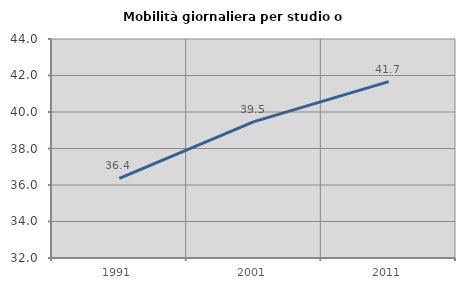
| Category | Mobilità giornaliera per studio o lavoro |
|---|---|
| 1991.0 | 36.364 |
| 2001.0 | 39.474 |
| 2011.0 | 41.667 |